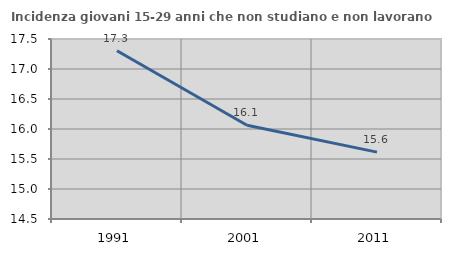
| Category | Incidenza giovani 15-29 anni che non studiano e non lavorano  |
|---|---|
| 1991.0 | 17.304 |
| 2001.0 | 16.063 |
| 2011.0 | 15.614 |